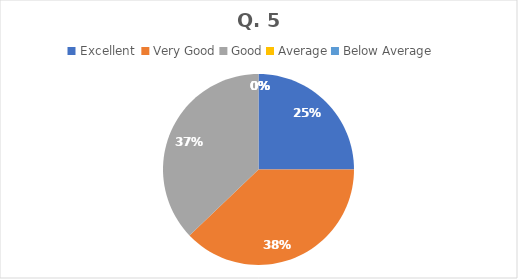
| Category | Series 0 |
|---|---|
| Excellent  | 35 |
| Very Good | 53 |
| Good | 52 |
| Average | 0 |
| Below Average | 0 |